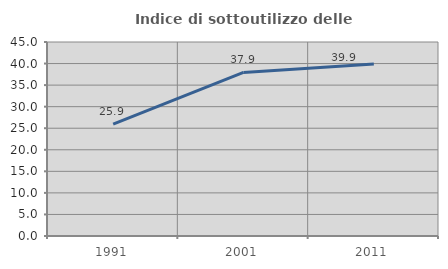
| Category | Indice di sottoutilizzo delle abitazioni  |
|---|---|
| 1991.0 | 25.937 |
| 2001.0 | 37.937 |
| 2011.0 | 39.876 |